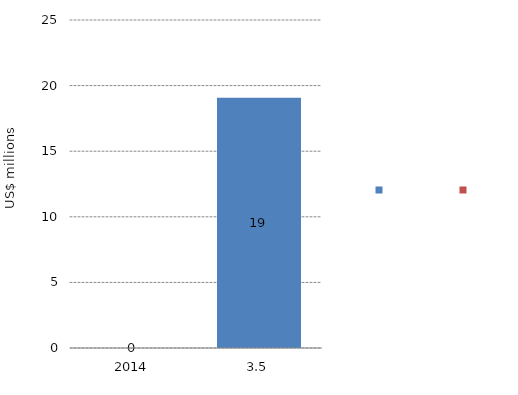
| Category | Series 1 | Series 0 |
|---|---|---|
| 2014.0 |  | 0 |
| 3.511043186568577 |  | 19.071 |